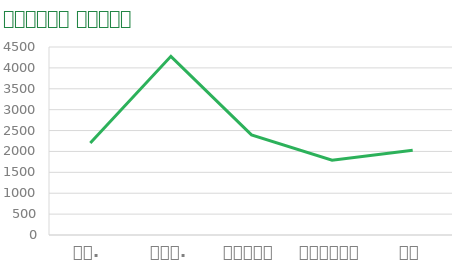
| Category | छाते |
|---|---|
| जन. | 2204 |
| फ़र. | 4277 |
| मार्च | 2398 |
| अप्रैल | 1792 |
| मई | 2030 |